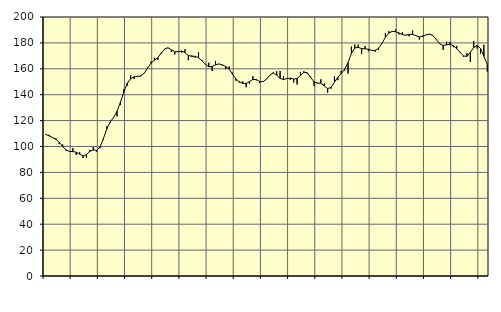
| Category | Piggar | Series 1 |
|---|---|---|
| nan | 109.1 | 109.36 |
| 87.0 | 109.1 | 108.2 |
| 87.0 | 106.6 | 106.95 |
| 87.0 | 106.4 | 105.59 |
| nan | 101.9 | 103.23 |
| 88.0 | 101.5 | 100 |
| 88.0 | 96.8 | 97.39 |
| 88.0 | 96 | 96.13 |
| nan | 98.8 | 96.05 |
| 89.0 | 93.4 | 95.6 |
| 89.0 | 95.8 | 94 |
| 89.0 | 91.1 | 92.74 |
| nan | 91.4 | 93.73 |
| 90.0 | 97.4 | 96.26 |
| 90.0 | 99.6 | 97.35 |
| 90.0 | 95.8 | 97.05 |
| nan | 98.7 | 99.54 |
| 91.0 | 105.5 | 106.22 |
| 91.0 | 115.7 | 113.7 |
| 91.0 | 118.4 | 119.02 |
| nan | 122.8 | 122.49 |
| 92.0 | 123.2 | 127.15 |
| 92.0 | 132 | 134.08 |
| 92.0 | 144.3 | 142.15 |
| nan | 147 | 148.83 |
| 93.0 | 154.9 | 152.35 |
| 93.0 | 152.2 | 153.77 |
| 93.0 | 154.6 | 154.04 |
| nan | 154.1 | 154.56 |
| 94.0 | 156.5 | 156.63 |
| 94.0 | 161.2 | 160.48 |
| 94.0 | 165.6 | 164.4 |
| nan | 168.6 | 166.68 |
| 95.0 | 166.9 | 168.72 |
| 95.0 | 172.6 | 171.88 |
| 95.0 | 175.2 | 175.32 |
| nan | 175.9 | 176.26 |
| 96.0 | 173.1 | 174.65 |
| 96.0 | 171.1 | 173.14 |
| 96.0 | 173.6 | 173.24 |
| nan | 172.2 | 173.7 |
| 97.0 | 175.1 | 172.51 |
| 97.0 | 166.6 | 170.37 |
| 97.0 | 170.3 | 169.58 |
| nan | 168.6 | 169.73 |
| 98.0 | 172.6 | 168.59 |
| 98.0 | 166.9 | 166.14 |
| 98.0 | 163.7 | 163.56 |
| nan | 164.7 | 161.59 |
| 99.0 | 158.3 | 161.73 |
| 99.0 | 166.1 | 163.03 |
| 99.0 | 163.6 | 163.77 |
| nan | 162.6 | 163.07 |
| 0.0 | 159.7 | 161.71 |
| 0.0 | 161.7 | 159.82 |
| 0.0 | 157 | 155.83 |
| nan | 150.8 | 152.11 |
| 1.0 | 149.3 | 150.02 |
| 1.0 | 150.3 | 148.8 |
| 1.0 | 145.8 | 148.66 |
| nan | 148.2 | 150.12 |
| 2.0 | 154.3 | 151.82 |
| 2.0 | 151.2 | 151.65 |
| 2.0 | 149 | 150.24 |
| nan | 150.1 | 150.01 |
| 3.0 | 152.2 | 151.98 |
| 3.0 | 155 | 155.21 |
| 3.0 | 157.4 | 156.74 |
| nan | 158.1 | 155.14 |
| 4.0 | 158.3 | 152.58 |
| 4.0 | 154.1 | 151.64 |
| 4.0 | 152.8 | 152.55 |
| nan | 151.4 | 152.81 |
| 5.0 | 149.4 | 152.07 |
| 5.0 | 147.9 | 152.5 |
| 5.0 | 157.6 | 154.77 |
| nan | 158.1 | 157.28 |
| 6.0 | 156.2 | 156.93 |
| 6.0 | 153.9 | 153.37 |
| 6.0 | 146.6 | 149.91 |
| nan | 148.5 | 149.02 |
| 7.0 | 151.9 | 148.78 |
| 7.0 | 148.7 | 146.77 |
| 7.0 | 141.6 | 144.7 |
| nan | 144.7 | 145.69 |
| 8.0 | 154.4 | 149.66 |
| 8.0 | 151.2 | 153.49 |
| 8.0 | 158.5 | 156.39 |
| nan | 158.6 | 159.51 |
| 9.0 | 156.3 | 164.88 |
| 9.0 | 177.2 | 171.81 |
| 9.0 | 178.7 | 176.12 |
| nan | 178.7 | 176.51 |
| 10.0 | 171.4 | 175.66 |
| 10.0 | 177.5 | 175.38 |
| 10.0 | 173.6 | 175.16 |
| nan | 174.2 | 174.24 |
| 11.0 | 173.2 | 174.18 |
| 11.0 | 174.7 | 175.94 |
| 11.0 | 179.5 | 179.66 |
| nan | 187.7 | 184.21 |
| 12.0 | 189.1 | 187.51 |
| 12.0 | 188.4 | 188.88 |
| 12.0 | 190.4 | 188.64 |
| nan | 186.6 | 187.69 |
| 13.0 | 188.2 | 186.37 |
| 13.0 | 185.6 | 185.97 |
| 13.0 | 185.1 | 186.58 |
| nan | 189.6 | 186.59 |
| 14.0 | 185.7 | 185.56 |
| 14.0 | 182.5 | 184.61 |
| 14.0 | 185.7 | 185.03 |
| nan | 186.1 | 186.28 |
| 15.0 | 187 | 186.73 |
| 15.0 | 185.4 | 185.58 |
| 15.0 | 183.2 | 182.66 |
| nan | 179.4 | 179.21 |
| 16.0 | 174.6 | 177.99 |
| 16.0 | 181 | 178.48 |
| 16.0 | 180.7 | 178.9 |
| nan | 176.7 | 177.85 |
| 17.0 | 177.7 | 175.48 |
| 17.0 | 172.3 | 172.71 |
| 17.0 | 169.1 | 169.93 |
| nan | 172.2 | 169.58 |
| 18.0 | 165.3 | 172.73 |
| 18.0 | 181.4 | 176.42 |
| 18.0 | 175.6 | 178.17 |
| nan | 171.6 | 175.78 |
| 19.0 | 178.5 | 169.68 |
| 19.0 | 157.9 | 163.36 |